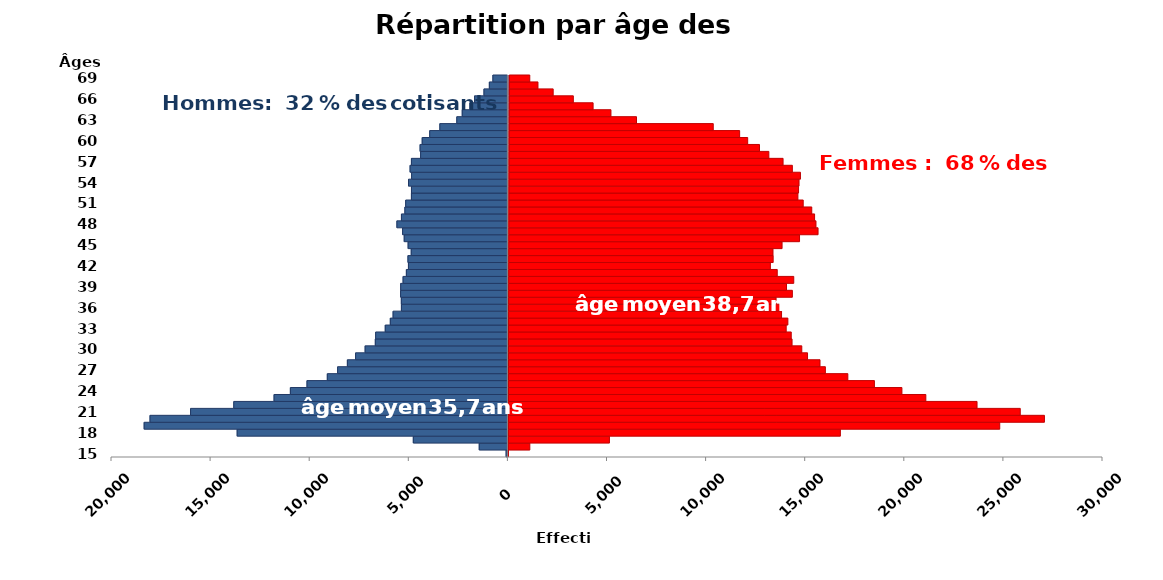
| Category | age | Homme | Femme |
|---|---|---|---|
| 15.0 | 15 | -89 | 33 |
| 16.0 | 16 | -1446 | 1115 |
| 17.0 | 17 | -4772 | 5131 |
| 18.0 | 18 | -13659 | 16782 |
| 19.0 | 19 | -18352 | 24822 |
| 20.0 | 20 | -18056 | 27075 |
| 21.0 | 21 | -16010 | 25855 |
| 22.0 | 22 | -13830 | 23673 |
| 23.0 | 23 | -11798 | 21089 |
| 24.0 | 24 | -10975 | 19881 |
| 25.0 | 25 | -10136 | 18492 |
| 26.0 | 26 | -9111 | 17150 |
| 27.0 | 27 | -8591 | 16016 |
| 28.0 | 28 | -8099 | 15744 |
| 29.0 | 29 | -7684 | 15114 |
| 30.0 | 30 | -7203 | 14823 |
| 31.0 | 31 | -6689 | 14331 |
| 32.0 | 32 | -6672 | 14289 |
| 33.0 | 33 | -6188 | 14033 |
| 34.0 | 34 | -5932 | 14117 |
| 35.0 | 35 | -5792 | 13797 |
| 36.0 | 36 | -5372 | 13801 |
| 37.0 | 37 | -5376 | 13519 |
| 38.0 | 38 | -5413 | 14340 |
| 39.0 | 39 | -5408 | 14043 |
| 40.0 | 40 | -5288 | 14408 |
| 41.0 | 41 | -5122 | 13574 |
| 42.0 | 42 | -5018 | 13226 |
| 43.0 | 43 | -5042 | 13366 |
| 44.0 | 44 | -4877 | 13356 |
| 45.0 | 45 | -5034 | 13813 |
| 46.0 | 46 | -5231 | 14694 |
| 47.0 | 47 | -5313 | 15627 |
| 48.0 | 48 | -5600 | 15521 |
| 49.0 | 49 | -5371 | 15450 |
| 50.0 | 50 | -5198 | 15306 |
| 51.0 | 51 | -5157 | 14874 |
| 52.0 | 52 | -4867 | 14605 |
| 53.0 | 53 | -4865 | 14637 |
| 54.0 | 54 | -5015 | 14660 |
| 55.0 | 55 | -4858 | 14730 |
| 56.0 | 56 | -4935 | 14321 |
| 57.0 | 57 | -4867 | 13852 |
| 58.0 | 58 | -4403 | 13133 |
| 59.0 | 59 | -4430 | 12660 |
| 60.0 | 60 | -4323 | 12063 |
| 61.0 | 61 | -3944 | 11657 |
| 62.0 | 62 | -3433 | 10324 |
| 63.0 | 63 | -2578 | 6451 |
| 64.0 | 64 | -2304 | 5160 |
| 65.0 | 65 | -1917 | 4259 |
| 66.0 | 66 | -1682 | 3261 |
| 67.0 | 67 | -1207 | 2243 |
| 68.0 | 68 | -936 | 1474 |
| 69.0 | 69 | -757 | 1060 |